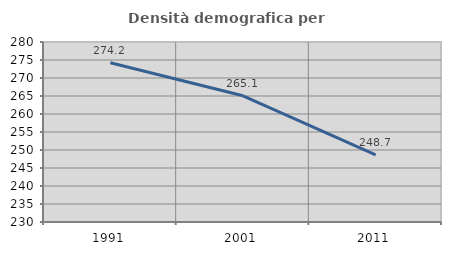
| Category | Densità demografica |
|---|---|
| 1991.0 | 274.247 |
| 2001.0 | 265.051 |
| 2011.0 | 248.652 |